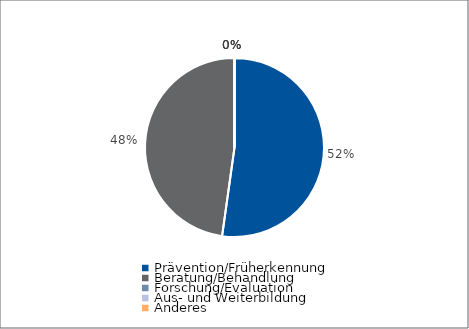
| Category | Series 0 |
|---|---|
| Prävention/Früherkennung | 3595 |
| Beratung/Behandlung | 3290 |
| Forschung/Evaluation | 0 |
| Aus- und Weiterbildung | 0 |
| Anderes | 0 |